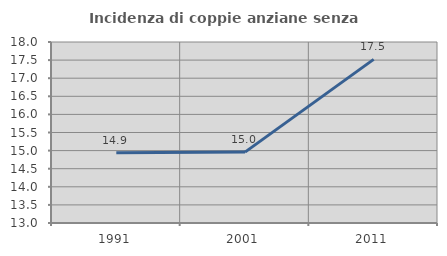
| Category | Incidenza di coppie anziane senza figli  |
|---|---|
| 1991.0 | 14.943 |
| 2001.0 | 14.958 |
| 2011.0 | 17.52 |